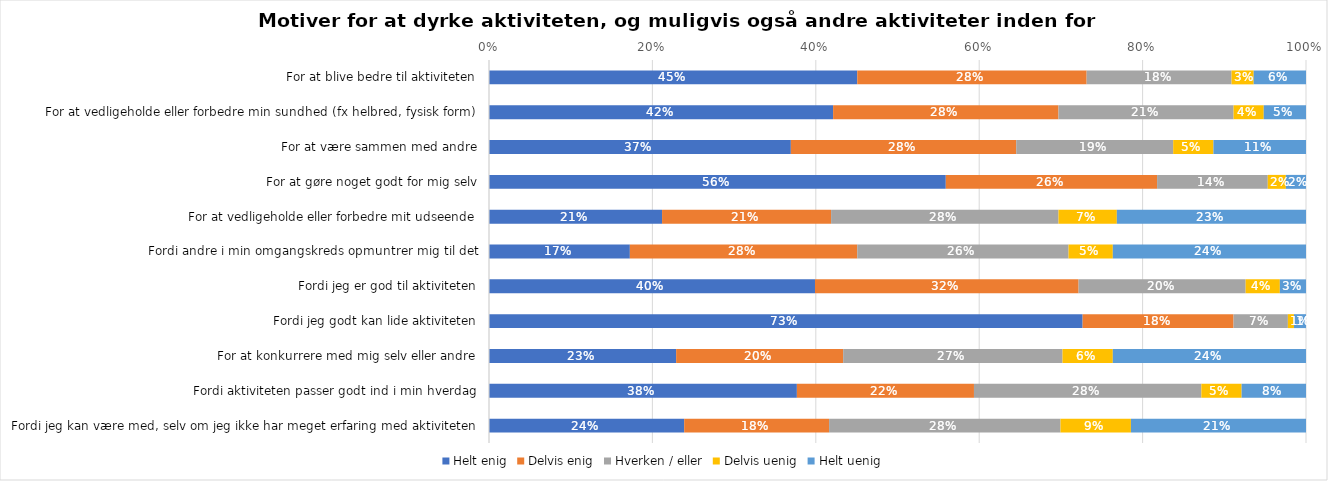
| Category | Helt enig | Delvis enig | Hverken / eller | Delvis uenig | Helt uenig |
|---|---|---|---|---|---|
| For at blive bedre til aktiviteten | 0.451 | 0.281 | 0.177 | 0.027 | 0.064 |
| For at vedligeholde eller forbedre min sundhed (fx helbred, fysisk form) | 0.421 | 0.276 | 0.214 | 0.037 | 0.052 |
| For at være sammen med andre | 0.369 | 0.276 | 0.192 | 0.049 | 0.113 |
| For at gøre noget godt for mig selv | 0.559 | 0.259 | 0.135 | 0.022 | 0.025 |
| For at vedligeholde eller forbedre mit udseende | 0.212 | 0.207 | 0.278 | 0.071 | 0.232 |
| Fordi andre i min omgangskreds opmuntrer mig til det | 0.172 | 0.278 | 0.259 | 0.054 | 0.236 |
| Fordi jeg er god til aktiviteten | 0.399 | 0.323 | 0.204 | 0.042 | 0.032 |
| Fordi jeg godt kan lide aktiviteten | 0.727 | 0.185 | 0.067 | 0.007 | 0.015 |
| For at konkurrere med mig selv eller andre | 0.229 | 0.204 | 0.268 | 0.062 | 0.236 |
| Fordi aktiviteten passer godt ind i min hverdag | 0.377 | 0.217 | 0.278 | 0.049 | 0.079 |
| Fordi jeg kan være med, selv om jeg ikke har meget erfaring med aktiviteten | 0.239 | 0.177 | 0.283 | 0.086 | 0.214 |